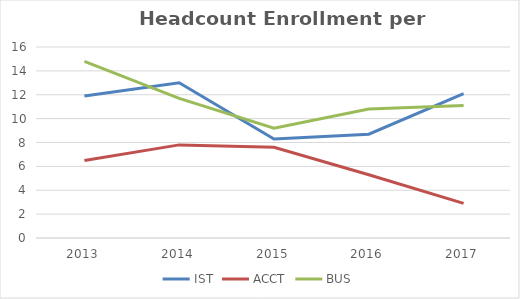
| Category | IST | ACCT | BUS |
|---|---|---|---|
| 2013.0 | 11.9 | 6.5 | 14.8 |
| 2014.0 | 13 | 7.8 | 11.7 |
| 2015.0 | 8.3 | 7.6 | 9.2 |
| 2016.0 | 8.7 | 5.3 | 10.8 |
| 2017.0 | 12.1 | 2.9 | 11.1 |